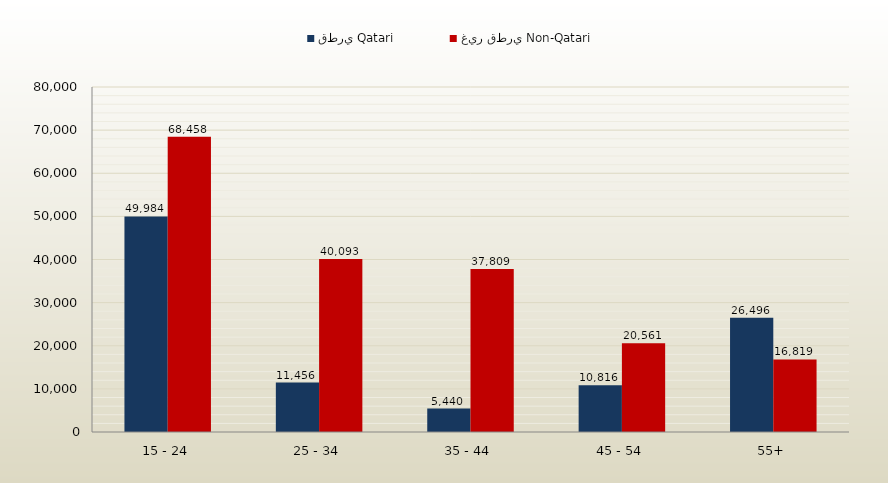
| Category | قطري Qatari | غير قطري Non-Qatari |
|---|---|---|
| 15 - 24 | 49984 | 68458 |
| 25 - 34 | 11456 | 40093 |
| 35 - 44 | 5440 | 37809 |
| 45 - 54 | 10816 | 20561 |
| 55+ | 26496 | 16819 |